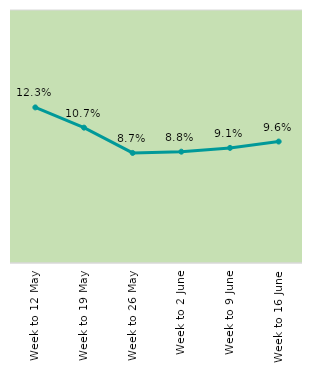
| Category | Series 0 |
|---|---|
| Week to 12 May | 0.123 |
| Week to 19 May | 0.107 |
| Week to 26 May | 0.087 |
| Week to 2 June | 0.088 |
| Week to 9 June | 0.091 |
| Week to 16 June | 0.096 |